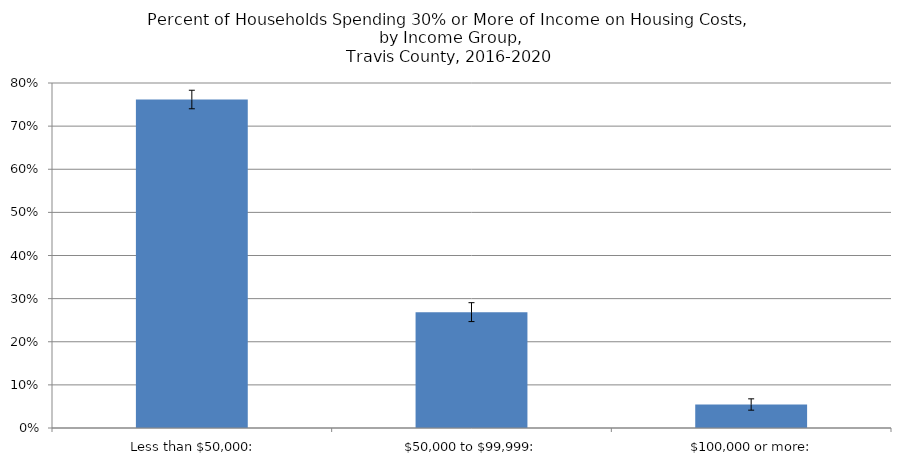
| Category | % Cost-Burdened |
|---|---|
|   Less than $50,000: | 0.762 |
|   $50,000 to $99,999: | 0.269 |
|   $100,000 or more: | 0.054 |